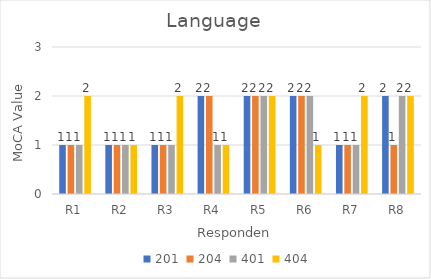
| Category | 201 | 204 | 401 | 404 |
|---|---|---|---|---|
| R1 | 1 | 1 | 1 | 2 |
| R2 | 1 | 1 | 1 | 1 |
| R3 | 1 | 1 | 1 | 2 |
| R4 | 2 | 2 | 1 | 1 |
| R5 | 2 | 2 | 2 | 2 |
| R6 | 2 | 2 | 2 | 1 |
| R7 | 1 | 1 | 1 | 2 |
| R8 | 2 | 1 | 2 | 2 |